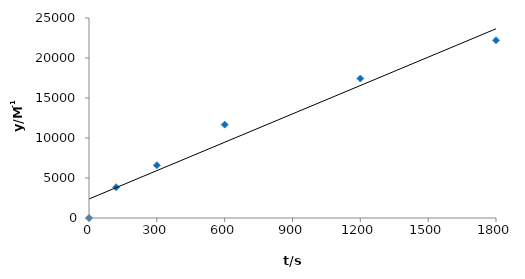
| Category | Series 0 |
|---|---|
| 0.0 | 0 |
| 120.0 | 3851.207 |
| 300.0 | 6595.081 |
| 600.0 | 11671.525 |
| 1200.0 | 17433.873 |
| 1800.0 | 22217.372 |